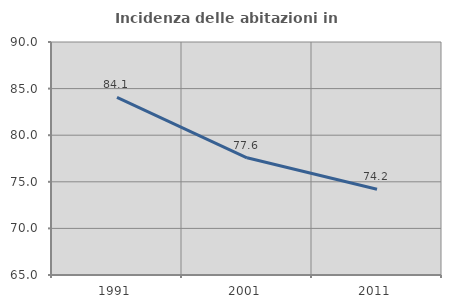
| Category | Incidenza delle abitazioni in proprietà  |
|---|---|
| 1991.0 | 84.058 |
| 2001.0 | 77.578 |
| 2011.0 | 74.208 |